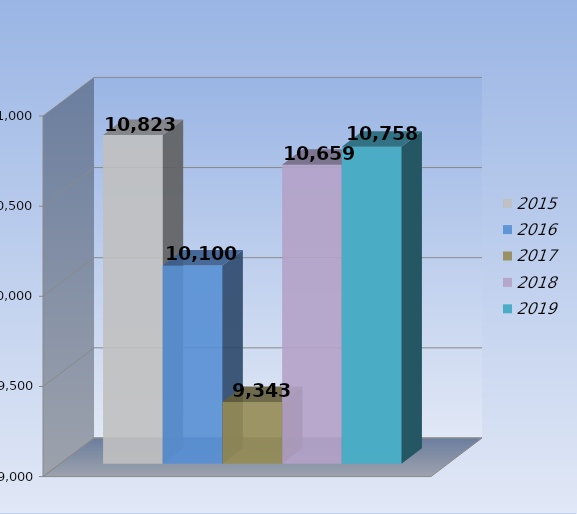
| Category | 2015 | 2016 | 2017 | 2018 | 2019 |
|---|---|---|---|---|---|
| 0 | 10823 | 10100 | 9343 | 10659 | 10758 |